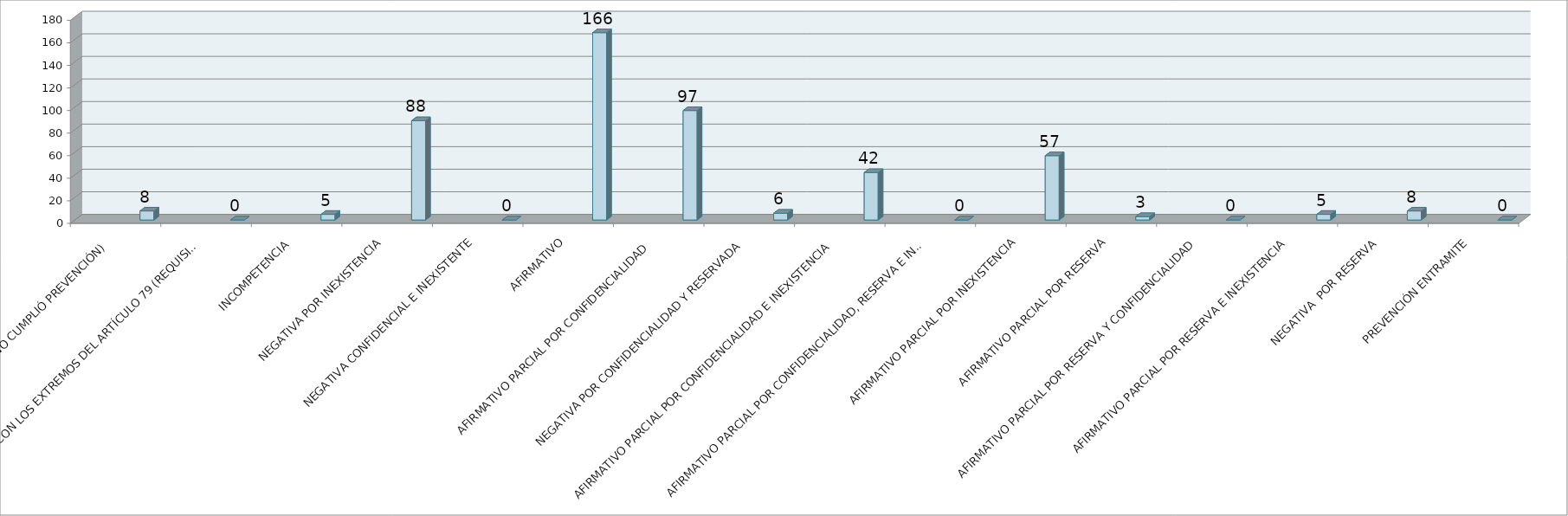
| Category | Series 0 | Series 1 | Series 2 | Series 3 | Series 4 |
|---|---|---|---|---|---|
| SE TIENE POR NO PRESENTADA ( NO CUMPLIÓ PREVENCIÓN) |  |  |  |  | 8 |
| NO CUMPLIO CON LOS EXTREMOS DEL ARTÍCULO 79 (REQUISITOS) |  |  |  |  | 0 |
| INCOMPETENCIA  |  |  |  |  | 5 |
| NEGATIVA POR INEXISTENCIA |  |  |  |  | 88 |
| NEGATIVA CONFIDENCIAL E INEXISTENTE |  |  |  |  | 0 |
| AFIRMATIVO |  |  |  |  | 166 |
| AFIRMATIVO PARCIAL POR CONFIDENCIALIDAD  |  |  |  |  | 97 |
| NEGATIVA POR CONFIDENCIALIDAD Y RESERVADA |  |  |  |  | 6 |
| AFIRMATIVO PARCIAL POR CONFIDENCIALIDAD E INEXISTENCIA |  |  |  |  | 42 |
| AFIRMATIVO PARCIAL POR CONFIDENCIALIDAD, RESERVA E INEXISTENCIA |  |  |  |  | 0 |
| AFIRMATIVO PARCIAL POR INEXISTENCIA |  |  |  |  | 57 |
| AFIRMATIVO PARCIAL POR RESERVA |  |  |  |  | 3 |
| AFIRMATIVO PARCIAL POR RESERVA Y CONFIDENCIALIDAD |  |  |  |  | 0 |
| AFIRMATIVO PARCIAL POR RESERVA E INEXISTENCIA |  |  |  |  | 5 |
| NEGATIVA  POR RESERVA |  |  |  |  | 8 |
| PREVENCIÓN ENTRAMITE |  |  |  |  | 0 |